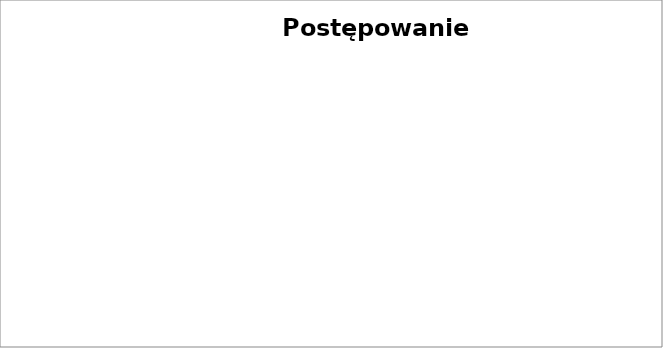
| Category | Postępowanie przymuszające |
|---|---|
| 1.0 | 0 |
| nan | 0 |
| nan | 0 |